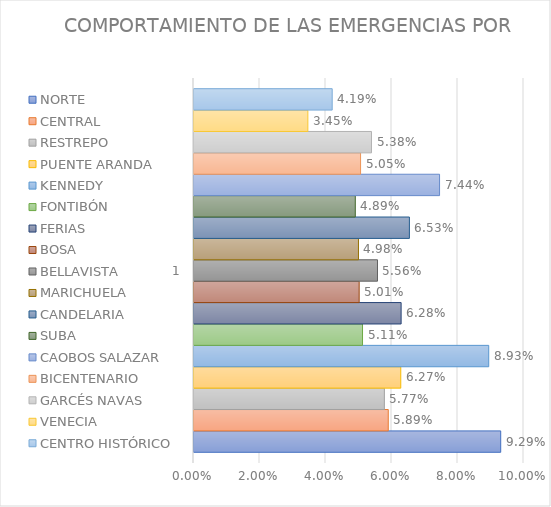
| Category | NORTE | CENTRAL | RESTREPO | PUENTE ARANDA | KENNEDY | FONTIBÓN | FERIAS | BOSA | BELLAVISTA | MARICHUELA | CANDELARIA | SUBA | CAOBOS SALAZAR | BICENTENARIO | GARCÉS NAVAS | VENECIA | CENTRO HISTÓRICO |
|---|---|---|---|---|---|---|---|---|---|---|---|---|---|---|---|---|---|
| 0 | 0.093 | 0.059 | 0.058 | 0.063 | 0.089 | 0.051 | 0.063 | 0.05 | 0.056 | 0.05 | 0.065 | 0.049 | 0.074 | 0.05 | 0.054 | 0.035 | 0.042 |